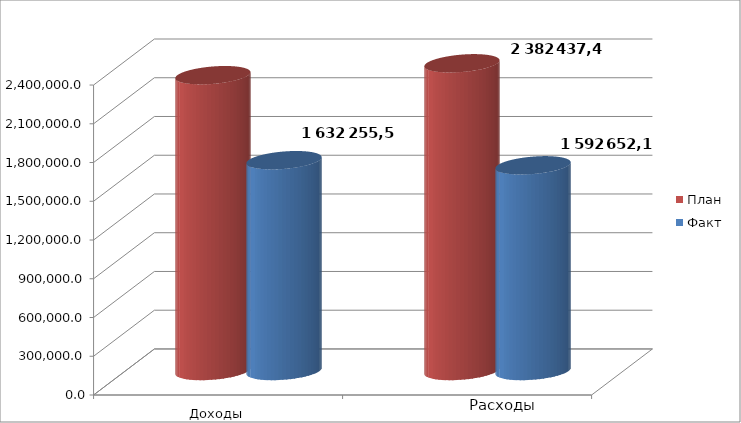
| Category | План | Факт |
|---|---|---|
| 0 | 2290457.9 | 1632255.5 |
| 1 | 2382437.4 | 1592652.1 |